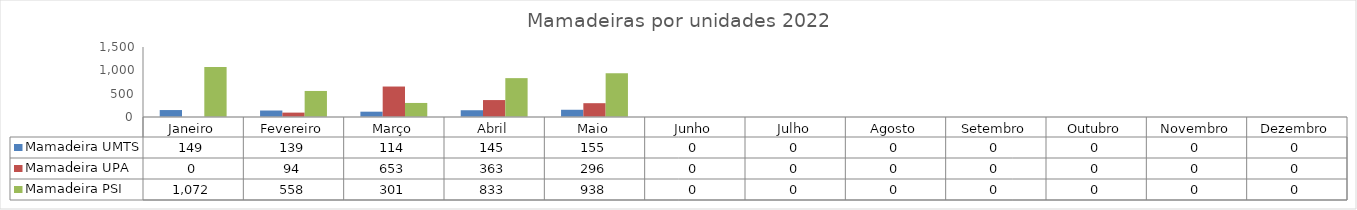
| Category | Mamadeira UMTS | Mamadeira UPA | Mamadeira PSI |
|---|---|---|---|
| Janeiro | 149 | 0 | 1072 |
| Fevereiro | 139 | 94 | 558 |
| Março | 114 | 653 | 301 |
| Abril | 145 | 363 | 833 |
| Maio | 155 | 296 | 938 |
| Junho | 0 | 0 | 0 |
| Julho | 0 | 0 | 0 |
| Agosto | 0 | 0 | 0 |
| Setembro | 0 | 0 | 0 |
| Outubro | 0 | 0 | 0 |
| Novembro | 0 | 0 | 0 |
| Dezembro | 0 | 0 | 0 |